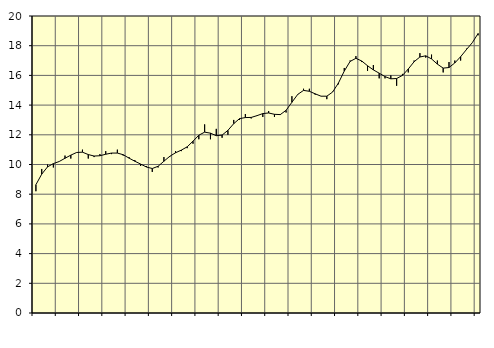
| Category | Piggar | Series 1 |
|---|---|---|
| nan | 8.2 | 8.64 |
| 1.0 | 9.7 | 9.35 |
| 1.0 | 10 | 9.84 |
| 1.0 | 9.8 | 10.06 |
| nan | 10.2 | 10.2 |
| 2.0 | 10.6 | 10.42 |
| 2.0 | 10.4 | 10.63 |
| 2.0 | 10.8 | 10.81 |
| nan | 11 | 10.83 |
| 3.0 | 10.4 | 10.67 |
| 3.0 | 10.5 | 10.57 |
| 3.0 | 10.7 | 10.59 |
| nan | 10.9 | 10.69 |
| 4.0 | 10.7 | 10.77 |
| 4.0 | 11 | 10.77 |
| 4.0 | 10.6 | 10.66 |
| nan | 10.5 | 10.43 |
| 5.0 | 10.3 | 10.22 |
| 5.0 | 9.9 | 10.03 |
| 5.0 | 9.9 | 9.83 |
| nan | 9.5 | 9.73 |
| 6.0 | 9.8 | 9.88 |
| 6.0 | 10.5 | 10.22 |
| 6.0 | 10.5 | 10.55 |
| nan | 10.9 | 10.79 |
| 7.0 | 10.9 | 10.97 |
| 7.0 | 11.1 | 11.19 |
| 7.0 | 11.4 | 11.57 |
| nan | 11.7 | 11.97 |
| 8.0 | 12.7 | 12.18 |
| 8.0 | 11.7 | 12.11 |
| 8.0 | 12.4 | 11.94 |
| nan | 11.8 | 11.98 |
| 9.0 | 12 | 12.3 |
| 9.0 | 13 | 12.75 |
| 9.0 | 13 | 13.09 |
| nan | 13.4 | 13.16 |
| 10.0 | 13.1 | 13.17 |
| 10.0 | 13.3 | 13.29 |
| 10.0 | 13.2 | 13.43 |
| nan | 13.6 | 13.47 |
| 11.0 | 13.2 | 13.38 |
| 11.0 | 13.4 | 13.36 |
| 11.0 | 13.5 | 13.65 |
| nan | 14.6 | 14.19 |
| 12.0 | 14.7 | 14.72 |
| 12.0 | 15.1 | 14.99 |
| 12.0 | 15.1 | 14.93 |
| nan | 14.7 | 14.76 |
| 13.0 | 14.6 | 14.6 |
| 13.0 | 14.4 | 14.6 |
| 13.0 | 14.9 | 14.88 |
| nan | 15.4 | 15.49 |
| 14.0 | 16.5 | 16.29 |
| 14.0 | 17 | 16.94 |
| 14.0 | 17.3 | 17.15 |
| nan | 16.9 | 16.97 |
| 15.0 | 16.3 | 16.65 |
| 15.0 | 16.7 | 16.37 |
| 15.0 | 15.8 | 16.15 |
| nan | 15.8 | 15.92 |
| 16.0 | 16 | 15.77 |
| 16.0 | 15.3 | 15.79 |
| 16.0 | 16.1 | 16 |
| nan | 16.2 | 16.43 |
| 17.0 | 17 | 16.92 |
| 17.0 | 17.5 | 17.24 |
| 17.0 | 17.2 | 17.32 |
| nan | 17.4 | 17.11 |
| 18.0 | 17 | 16.76 |
| 18.0 | 16.2 | 16.49 |
| 18.0 | 16.9 | 16.53 |
| nan | 17 | 16.84 |
| 19.0 | 17 | 17.26 |
| 19.0 | 17.8 | 17.74 |
| 19.0 | 18.2 | 18.2 |
| nan | 18.7 | 18.82 |